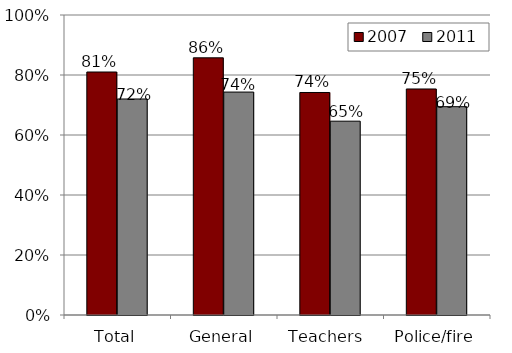
| Category | 2007 | 2011 |
|---|---|---|
| Total | 0.81 | 0.72 |
| General | 0.857 | 0.743 |
| Teachers  | 0.742 | 0.646 |
| Police/fire | 0.753 | 0.694 |